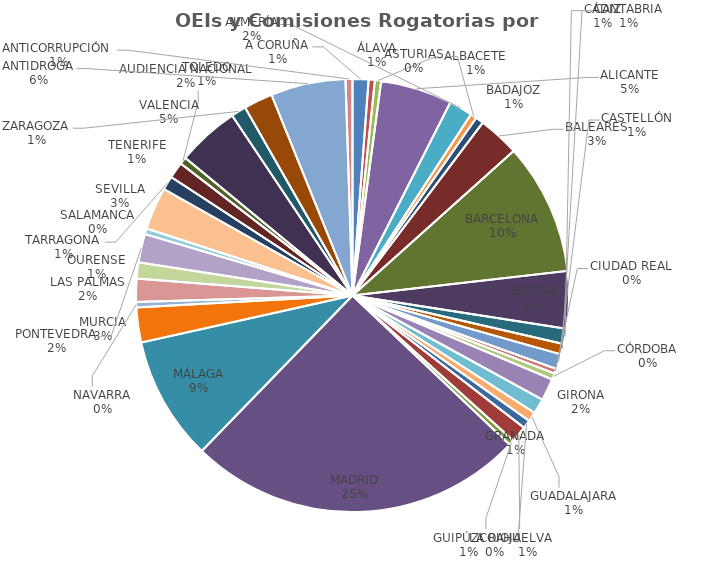
| Category | OEIs y Comisiones Rogatorias |
|---|---|
| A CORUÑA | 92 |
| ÁLAVA | 36 |
| ALBACETE | 36 |
| ALICANTE | 414 |
| ALMERÍA | 136 |
| ASTURIAS | 36 |
| BADAJOZ | 46 |
| BALEARES | 239 |
| BARCELONA | 761 |
| BIZKAIA | 331 |
| CÁDIZ | 88 |
| CANTABRIA | 61 |
| CASTELLÓN | 87 |
| CIUDAD REAL | 28 |
| CÓRDOBA | 36 |
| GIRONA | 128 |
| GRANADA | 87 |
| GUADALAJARA | 55 |
| GUIPÚZCOA | 49 |
| HUELVA | 95 |
| LA RIOJA | 32 |
| MADRID | 1949 |
| MÁLAGA | 717 |
| MURCIA | 202 |
| NAVARRA | 32 |
| LAS PALMAS | 133 |
| OURENSE | 93 |
| PONTEVEDRA | 165 |
| SALAMANCA | 33 |
| SEVILLA | 245 |
| TARRAGONA | 81 |
| TENERIFE | 94 |
| TOLEDO | 41 |
| VALENCIA | 361 |
| ZARAGOZA | 87 |
| AUDIENCIA NACIONAL | 167 |
| ANTIDROGA | 433 |
| ANTICORRUPCIÓN  | 40 |